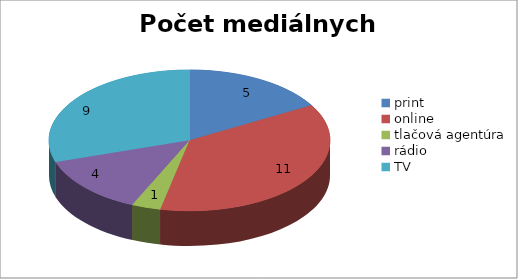
| Category | Počet mediálnych výstupov |
|---|---|
| print | 5 |
| online | 11 |
| tlačová agentúra | 1 |
| rádio | 4 |
| TV | 9 |